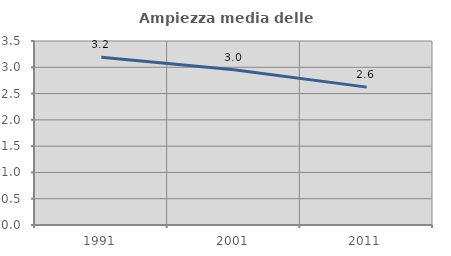
| Category | Ampiezza media delle famiglie |
|---|---|
| 1991.0 | 3.189 |
| 2001.0 | 2.955 |
| 2011.0 | 2.623 |